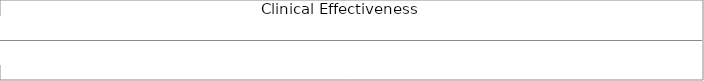
| Category | Series 0 | Series 1 |
|---|---|---|
| 0 | 0 | 0 |
| 1 | 0 | 0 |
| 2 | 0 | 0 |
| 3 | 0 | 0 |
| 4 | 0 | 0 |
| 5 | 0 | 0 |